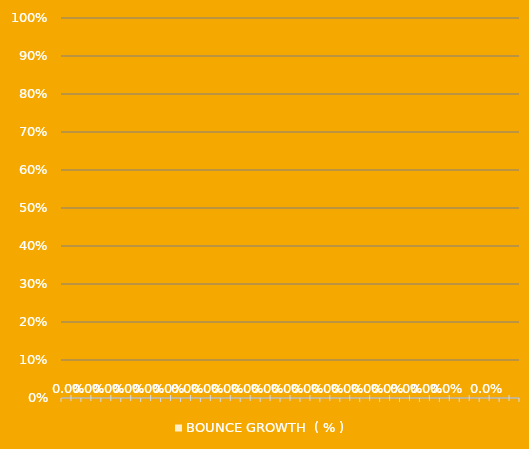
| Category | BOUNCE GROWTH  ( % ) |
|---|---|
|  | 0 |
|  | 0 |
|  | 0 |
|  | 0 |
|  | 0 |
|  | 0 |
|  | 0 |
|  | 0 |
|  | 0 |
|  | 0 |
|  | 0 |
|  | 0 |
|  | 0 |
|  | 0 |
|  | 0 |
|  | 0 |
|  | 0 |
|  | 0 |
|  | 0 |
|  | 0 |
|  | 0 |
|  | 0 |
|  | 0 |